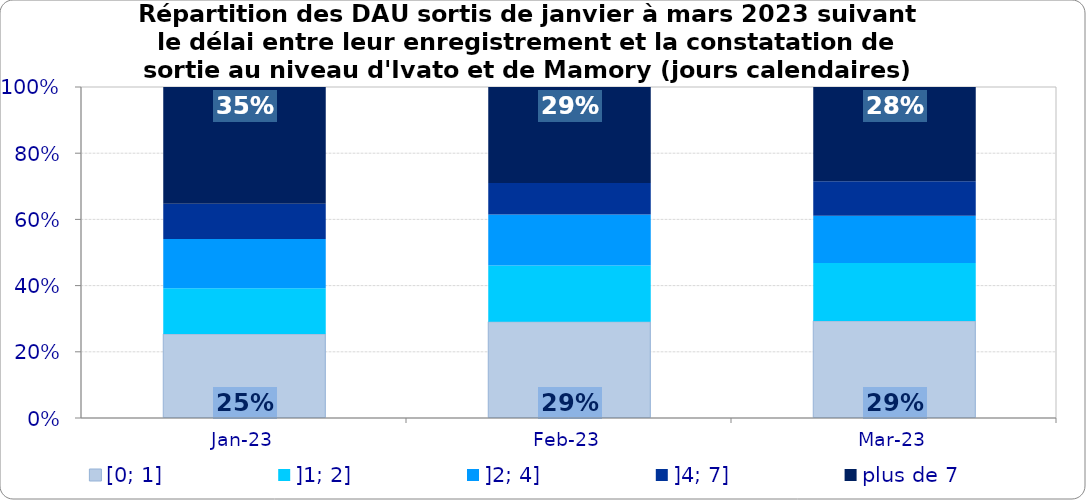
| Category | [0; 1] | ]1; 2] | ]2; 4] | ]4; 7] | plus de 7 |
|---|---|---|---|---|---|
| 2023-01-01 | 0.254 | 0.138 | 0.149 | 0.106 | 0.353 |
| 2023-02-01 | 0.291 | 0.17 | 0.155 | 0.095 | 0.29 |
| 2023-03-01 | 0.293 | 0.175 | 0.143 | 0.104 | 0.284 |